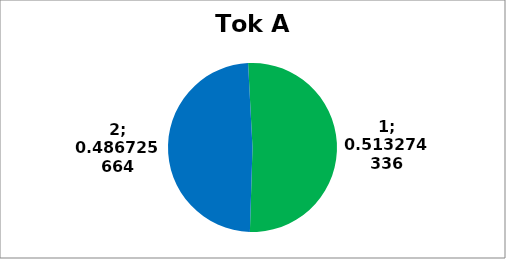
| Category | Series 0 |
|---|---|
| 0 | 116 |
| 1 | 110 |